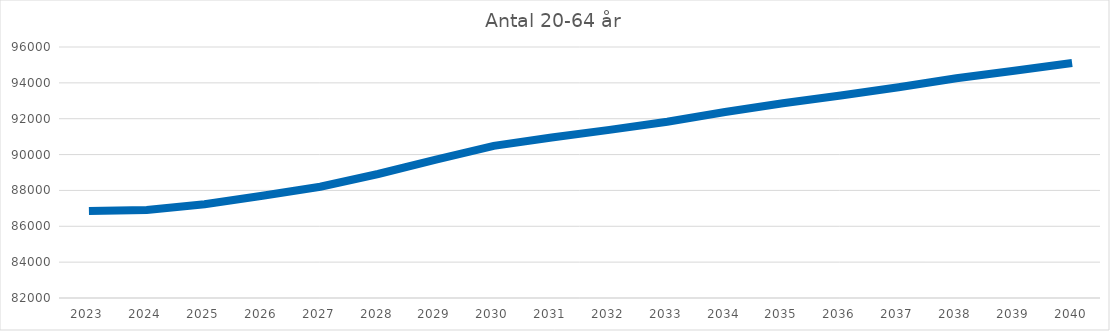
| Category | Antal 20-64 år |
|---|---|
| 2023.0 | 86850 |
| 2024.0 | 86914.958 |
| 2025.0 | 87228.771 |
| 2026.0 | 87706.517 |
| 2027.0 | 88205.11 |
| 2028.0 | 88916.638 |
| 2029.0 | 89716.22 |
| 2030.0 | 90486.015 |
| 2031.0 | 90953.967 |
| 2032.0 | 91378.899 |
| 2033.0 | 91832.933 |
| 2034.0 | 92372.552 |
| 2035.0 | 92861.557 |
| 2036.0 | 93296.419 |
| 2037.0 | 93750.736 |
| 2038.0 | 94252.314 |
| 2039.0 | 94670.703 |
| 2040.0 | 95102.68 |